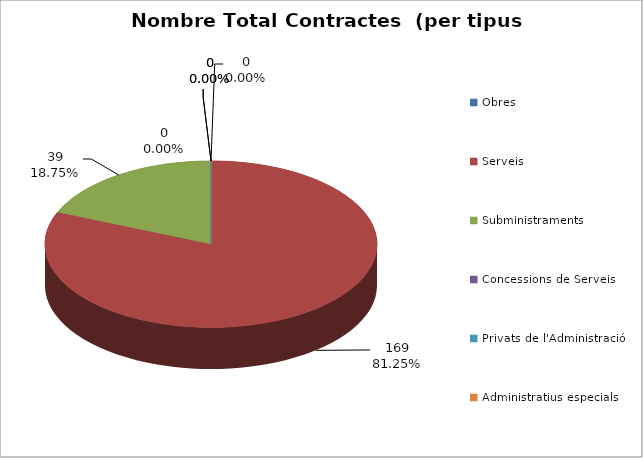
| Category | Nombre Total Contractes |
|---|---|
| Obres | 0 |
| Serveis | 169 |
| Subministraments | 39 |
| Concessions de Serveis | 0 |
| Privats de l'Administració | 0 |
| Administratius especials | 0 |